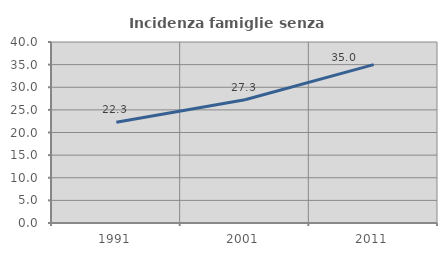
| Category | Incidenza famiglie senza nuclei |
|---|---|
| 1991.0 | 22.285 |
| 2001.0 | 27.253 |
| 2011.0 | 35.007 |